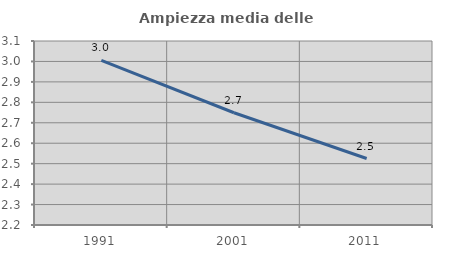
| Category | Ampiezza media delle famiglie |
|---|---|
| 1991.0 | 3.005 |
| 2001.0 | 2.749 |
| 2011.0 | 2.525 |